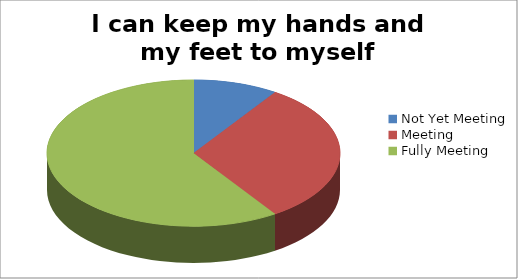
| Category | I can keep my hands and my feet to myself |
|---|---|
| Not Yet Meeting | 3 |
| Meeting | 10 |
| Fully Meeting | 19 |